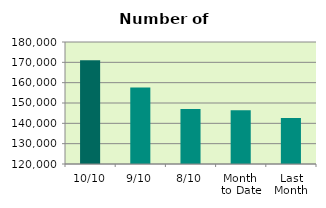
| Category | Series 0 |
|---|---|
| 10/10 | 170968 |
| 9/10 | 157664 |
| 8/10 | 147050 |
| Month 
to Date | 146487 |
| Last
Month | 142606.2 |